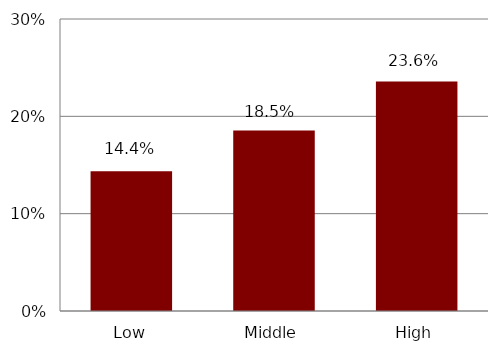
| Category | Inheritance |
|---|---|
| Low | 0.144 |
| Middle | 0.185 |
| High | 0.236 |